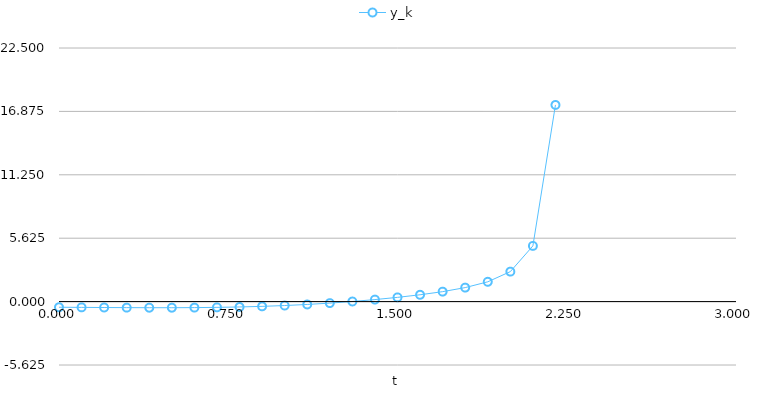
| Category | y_k |
|---|---|
| 0.0 | -0.5 |
| 0.1 | -0.512 |
| 0.2 | -0.525 |
| 0.3 | -0.535 |
| 0.4 | -0.542 |
| 0.5 | -0.542 |
| 0.6 | -0.533 |
| 0.7 | -0.512 |
| 0.8 | -0.476 |
| 0.9 | -0.423 |
| 1.0 | -0.349 |
| 1.1 | -0.254 |
| 1.2 | -0.134 |
| 1.3 | 0.009 |
| 1.4 | 0.178 |
| 1.5 | 0.375 |
| 1.6 | 0.605 |
| 1.7 | 0.883 |
| 1.8 | 1.241 |
| 1.9 | 1.757 |
| 2.0 | 2.66 |
| 2.1 | 4.942 |
| 2.2 | 17.449 |